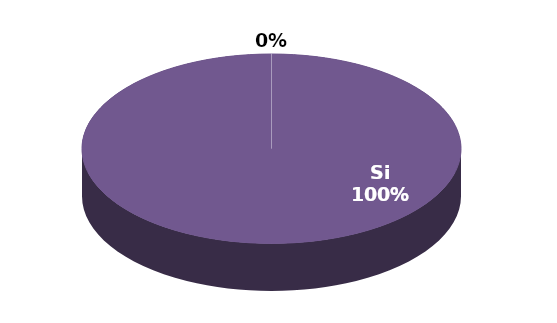
| Category | Series 1 |
|---|---|
| Si | 23 |